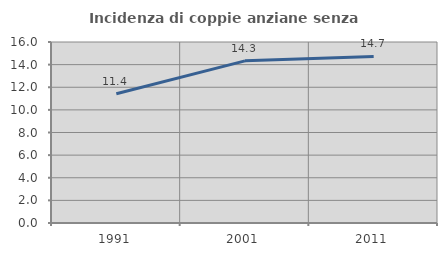
| Category | Incidenza di coppie anziane senza figli  |
|---|---|
| 1991.0 | 11.431 |
| 2001.0 | 14.332 |
| 2011.0 | 14.721 |